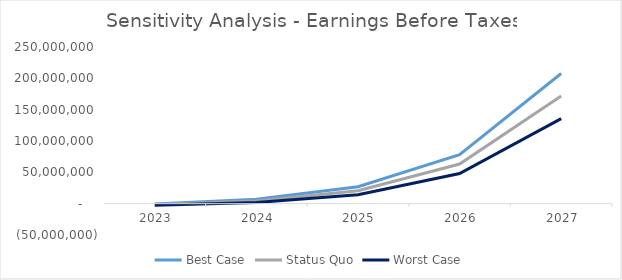
| Category | Best Case | Status Quo | Worst Case |
|---|---|---|---|
| 2023-12-01 | -379148.69 | -1498390.165 | -2617631.64 |
| 2024-12-01 | 7060196.592 | 4394410.08 | 1728623.568 |
| 2025-12-01 | 26988713.795 | 20639397.865 | 14290081.935 |
| 2026-12-01 | 78337510.061 | 63214838.912 | 48092167.762 |
| 2027-12-01 | 207700643.696 | 171681774.07 | 135662904.443 |